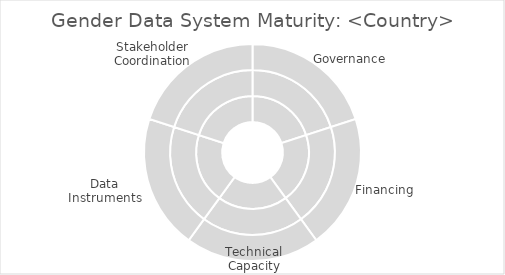
| Category | Series 0 | Series 1 | Series 2 |
|---|---|---|---|
| Governance | 1 | 2 | 3 |
| Financing | 1 | 2 | 3 |
| Technical Capacity | 1 | 2 | 3 |
| Data Instruments | 1 | 2 | 3 |
| Stakeholder Coordination | 1 | 2 | 3 |